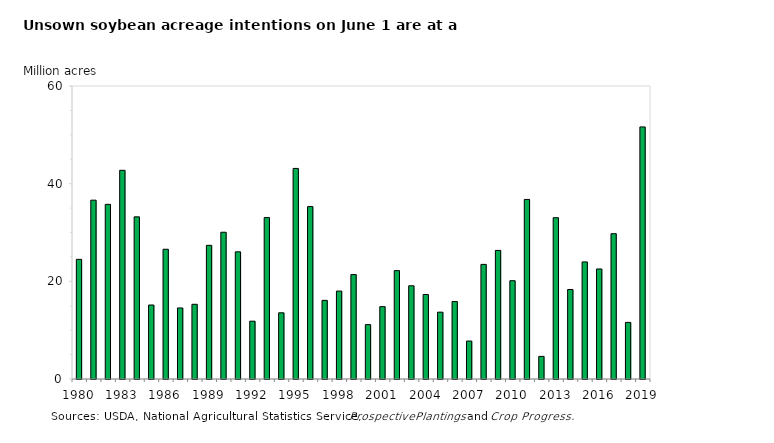
| Category | Soybean |
|---|---|
| 1980.0 | 24.506 |
| 1981.0 | 36.617 |
| 1982.0 | 35.765 |
| 1983.0 | 42.732 |
| 1984.0 | 33.2 |
| 1985.0 | 15.151 |
| 1986.0 | 26.569 |
| 1987.0 | 14.545 |
| 1988.0 | 15.298 |
| 1989.0 | 27.369 |
| 1990.0 | 30.053 |
| 1991.0 | 26.039 |
| 1992.0 | 11.836 |
| 1993.0 | 33.047 |
| 1994.0 | 13.556 |
| 1995.0 | 43.122 |
| 1996.0 | 35.307 |
| 1997.0 | 16.101 |
| 1998.0 | 18.006 |
| 1999.0 | 21.382 |
| 2000.0 | 11.14 |
| 2001.0 | 14.815 |
| 2002.0 | 22.189 |
| 2003.0 | 19.085 |
| 2004.0 | 17.298 |
| 2005.0 | 13.686 |
| 2006.0 | 15.86 |
| 2007.0 | 7.769 |
| 2008.0 | 23.473 |
| 2009.0 | 26.333 |
| 2010.0 | 20.125 |
| 2011.0 | 36.773 |
| 2012.0 | 4.632 |
| 2013.0 | 33.033 |
| 2014.0 | 18.325 |
| 2015.0 | 23.971 |
| 2016.0 | 22.532 |
| 2017.0 | 29.753 |
| 2018.0 | 11.595 |
| 2019.0 | 51.616 |